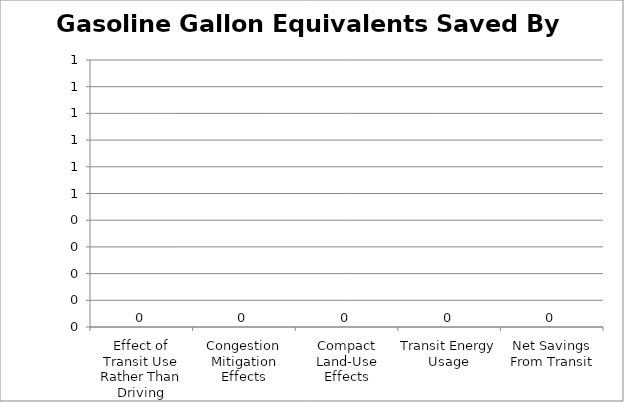
| Category | Series 0 |
|---|---|
| Effect of Transit Use Rather Than Driving | 0 |
| Congestion Mitigation Effects | 0 |
| Compact Land-Use Effects | 0 |
| Transit Energy Usage | 0 |
| Net Savings From Transit | 0 |